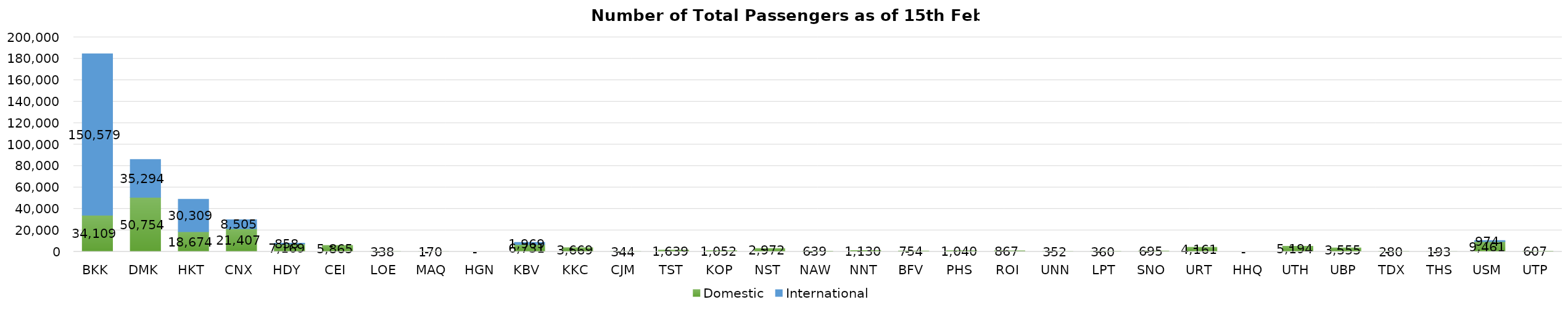
| Category | Domestic | International |
|---|---|---|
| BKK | 34109 | 150579 |
| DMK | 50754 | 35294 |
| HKT | 18674 | 30309 |
| CNX | 21407 | 8505 |
| HDY | 7169 | 858 |
| CEI | 5865 | 0 |
| LOE | 338 | 0 |
| MAQ | 170 | 0 |
| HGN | 0 | 0 |
| KBV | 6731 | 1969 |
| KKC | 3669 | 0 |
| CJM | 344 | 0 |
| TST | 1639 | 0 |
| KOP | 1052 | 0 |
| NST | 2972 | 0 |
| NAW | 639 | 0 |
| NNT | 1130 | 0 |
| BFV | 754 | 0 |
| PHS | 1040 | 0 |
| ROI | 867 | 0 |
| UNN | 352 | 0 |
| LPT | 360 | 0 |
| SNO | 695 | 0 |
| URT | 4161 | 0 |
| HHQ | 0 | 0 |
| UTH | 5194 | 0 |
| UBP | 3555 | 0 |
| TDX | 280 | 0 |
| THS | 193 | 0 |
| USM | 9461 | 974 |
| UTP | 607 | 0 |